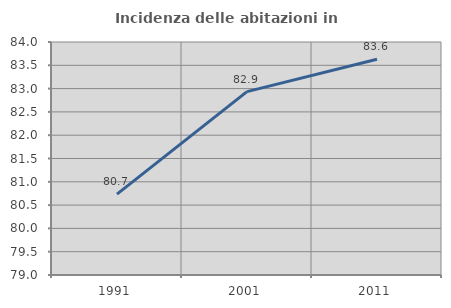
| Category | Incidenza delle abitazioni in proprietà  |
|---|---|
| 1991.0 | 80.736 |
| 2001.0 | 82.935 |
| 2011.0 | 83.631 |